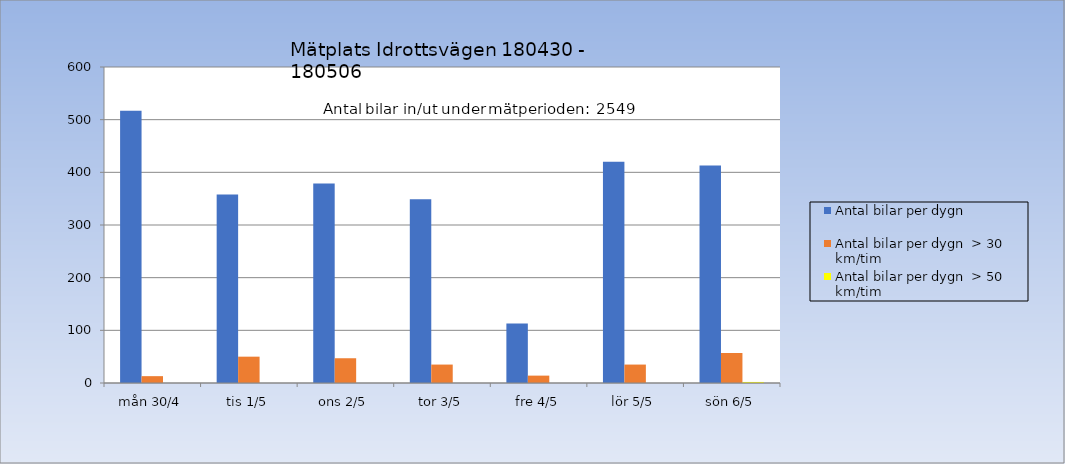
| Category | Antal bilar per dygn | Antal bilar per dygn  > 30 km/tim | Antal bilar per dygn  > 50 km/tim |
|---|---|---|---|
| mån 30/4 | 517 | 13 | 0 |
| tis 1/5 | 358 | 50 | 0 |
| ons 2/5 | 379 | 47 | 0 |
| tor 3/5 | 349 | 35 | 0 |
| fre 4/5 | 113 | 14 | 0 |
| lör 5/5 | 420 | 35 | 0 |
| sön 6/5 | 413 | 57 | 2 |